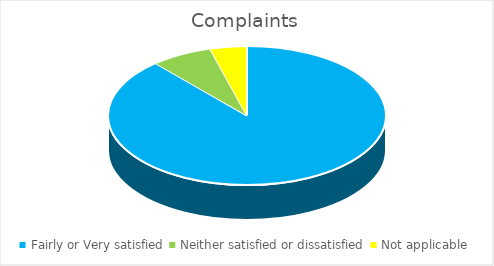
| Category | Series 0 |
|---|---|
| Fairly or Very satisfied | 88.57 |
| Neither satisfied or dissatisfied | 7.14 |
| Not applicable | 4.29 |